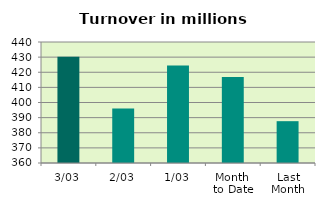
| Category | Series 0 |
|---|---|
| 3/03 | 430.239 |
| 2/03 | 396.109 |
| 1/03 | 424.471 |
| Month 
to Date | 416.94 |
| Last
Month | 387.65 |